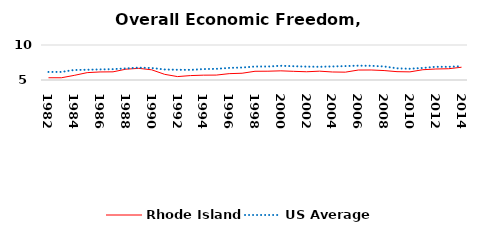
| Category | Rhode Island | US Average |
|---|---|---|
| 1982.0 | 5.323 | 6.149 |
| 1983.0 | 5.32 | 6.152 |
| 1984.0 | 5.662 | 6.429 |
| 1985.0 | 6.052 | 6.464 |
| 1986.0 | 6.151 | 6.512 |
| 1987.0 | 6.166 | 6.552 |
| 1988.0 | 6.546 | 6.659 |
| 1989.0 | 6.667 | 6.767 |
| 1990.0 | 6.454 | 6.71 |
| 1991.0 | 5.81 | 6.502 |
| 1992.0 | 5.488 | 6.463 |
| 1993.0 | 5.63 | 6.446 |
| 1994.0 | 5.69 | 6.563 |
| 1995.0 | 5.701 | 6.593 |
| 1996.0 | 5.908 | 6.73 |
| 1997.0 | 5.967 | 6.781 |
| 1998.0 | 6.247 | 6.926 |
| 1999.0 | 6.255 | 6.925 |
| 2000.0 | 6.309 | 7.031 |
| 2001.0 | 6.238 | 6.969 |
| 2002.0 | 6.178 | 6.912 |
| 2003.0 | 6.262 | 6.892 |
| 2004.0 | 6.144 | 6.934 |
| 2005.0 | 6.12 | 6.99 |
| 2006.0 | 6.422 | 7.048 |
| 2007.0 | 6.43 | 7.028 |
| 2008.0 | 6.349 | 6.935 |
| 2009.0 | 6.19 | 6.668 |
| 2010.0 | 6.161 | 6.605 |
| 2011.0 | 6.468 | 6.72 |
| 2012.0 | 6.571 | 6.883 |
| 2013.0 | 6.611 | 6.881 |
| 2014.0 | 6.826 | 6.973 |